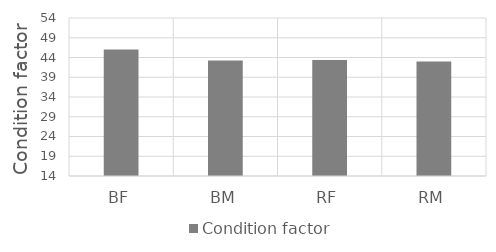
| Category | Condition factor |
|---|---|
| BF | 46 |
| BM | 43.246 |
| RF | 43.35 |
| RM | 43 |